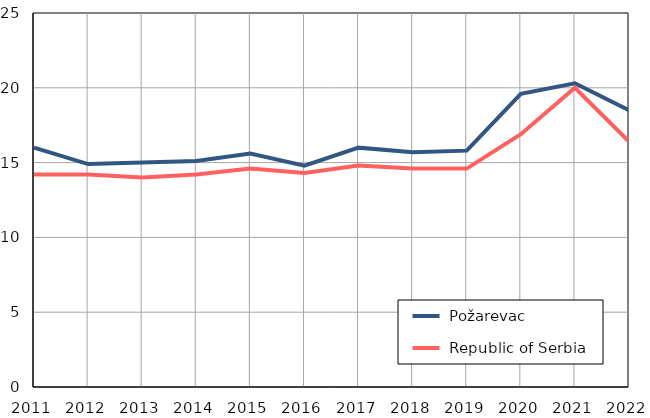
| Category |  Požarevac |  Republic of Serbia |
|---|---|---|
| 2011.0 | 16 | 14.2 |
| 2012.0 | 14.9 | 14.2 |
| 2013.0 | 15 | 14 |
| 2014.0 | 15.1 | 14.2 |
| 2015.0 | 15.6 | 14.6 |
| 2016.0 | 14.8 | 14.3 |
| 2017.0 | 16 | 14.8 |
| 2018.0 | 15.7 | 14.6 |
| 2019.0 | 15.8 | 14.6 |
| 2020.0 | 19.6 | 16.9 |
| 2021.0 | 20.3 | 20 |
| 2022.0 | 18.5 | 16.4 |